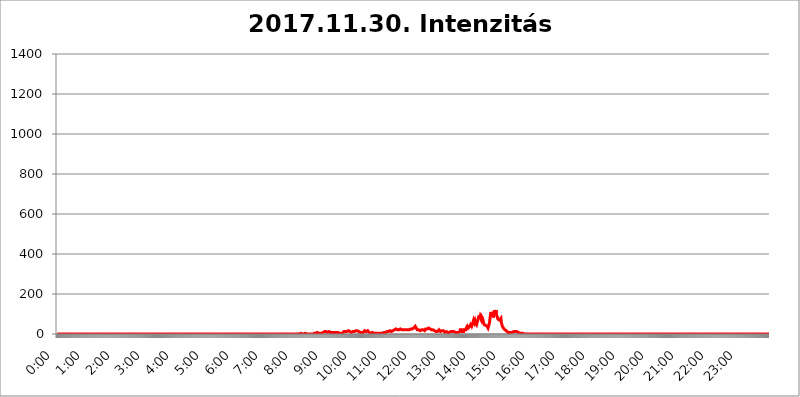
| Category | 2017.11.30. Intenzitás [W/m^2] |
|---|---|
| 0.0 | 0 |
| 0.0006944444444444445 | 0 |
| 0.001388888888888889 | 0 |
| 0.0020833333333333333 | 0 |
| 0.002777777777777778 | 0 |
| 0.003472222222222222 | 0 |
| 0.004166666666666667 | 0 |
| 0.004861111111111111 | 0 |
| 0.005555555555555556 | 0 |
| 0.0062499999999999995 | 0 |
| 0.006944444444444444 | 0 |
| 0.007638888888888889 | 0 |
| 0.008333333333333333 | 0 |
| 0.009027777777777779 | 0 |
| 0.009722222222222222 | 0 |
| 0.010416666666666666 | 0 |
| 0.011111111111111112 | 0 |
| 0.011805555555555555 | 0 |
| 0.012499999999999999 | 0 |
| 0.013194444444444444 | 0 |
| 0.013888888888888888 | 0 |
| 0.014583333333333332 | 0 |
| 0.015277777777777777 | 0 |
| 0.015972222222222224 | 0 |
| 0.016666666666666666 | 0 |
| 0.017361111111111112 | 0 |
| 0.018055555555555557 | 0 |
| 0.01875 | 0 |
| 0.019444444444444445 | 0 |
| 0.02013888888888889 | 0 |
| 0.020833333333333332 | 0 |
| 0.02152777777777778 | 0 |
| 0.022222222222222223 | 0 |
| 0.02291666666666667 | 0 |
| 0.02361111111111111 | 0 |
| 0.024305555555555556 | 0 |
| 0.024999999999999998 | 0 |
| 0.025694444444444447 | 0 |
| 0.02638888888888889 | 0 |
| 0.027083333333333334 | 0 |
| 0.027777777777777776 | 0 |
| 0.02847222222222222 | 0 |
| 0.029166666666666664 | 0 |
| 0.029861111111111113 | 0 |
| 0.030555555555555555 | 0 |
| 0.03125 | 0 |
| 0.03194444444444445 | 0 |
| 0.03263888888888889 | 0 |
| 0.03333333333333333 | 0 |
| 0.034027777777777775 | 0 |
| 0.034722222222222224 | 0 |
| 0.035416666666666666 | 0 |
| 0.036111111111111115 | 0 |
| 0.03680555555555556 | 0 |
| 0.0375 | 0 |
| 0.03819444444444444 | 0 |
| 0.03888888888888889 | 0 |
| 0.03958333333333333 | 0 |
| 0.04027777777777778 | 0 |
| 0.04097222222222222 | 0 |
| 0.041666666666666664 | 0 |
| 0.042361111111111106 | 0 |
| 0.04305555555555556 | 0 |
| 0.043750000000000004 | 0 |
| 0.044444444444444446 | 0 |
| 0.04513888888888889 | 0 |
| 0.04583333333333334 | 0 |
| 0.04652777777777778 | 0 |
| 0.04722222222222222 | 0 |
| 0.04791666666666666 | 0 |
| 0.04861111111111111 | 0 |
| 0.049305555555555554 | 0 |
| 0.049999999999999996 | 0 |
| 0.05069444444444445 | 0 |
| 0.051388888888888894 | 0 |
| 0.052083333333333336 | 0 |
| 0.05277777777777778 | 0 |
| 0.05347222222222222 | 0 |
| 0.05416666666666667 | 0 |
| 0.05486111111111111 | 0 |
| 0.05555555555555555 | 0 |
| 0.05625 | 0 |
| 0.05694444444444444 | 0 |
| 0.057638888888888885 | 0 |
| 0.05833333333333333 | 0 |
| 0.05902777777777778 | 0 |
| 0.059722222222222225 | 0 |
| 0.06041666666666667 | 0 |
| 0.061111111111111116 | 0 |
| 0.06180555555555556 | 0 |
| 0.0625 | 0 |
| 0.06319444444444444 | 0 |
| 0.06388888888888888 | 0 |
| 0.06458333333333334 | 0 |
| 0.06527777777777778 | 0 |
| 0.06597222222222222 | 0 |
| 0.06666666666666667 | 0 |
| 0.06736111111111111 | 0 |
| 0.06805555555555555 | 0 |
| 0.06874999999999999 | 0 |
| 0.06944444444444443 | 0 |
| 0.07013888888888889 | 0 |
| 0.07083333333333333 | 0 |
| 0.07152777777777779 | 0 |
| 0.07222222222222223 | 0 |
| 0.07291666666666667 | 0 |
| 0.07361111111111111 | 0 |
| 0.07430555555555556 | 0 |
| 0.075 | 0 |
| 0.07569444444444444 | 0 |
| 0.0763888888888889 | 0 |
| 0.07708333333333334 | 0 |
| 0.07777777777777778 | 0 |
| 0.07847222222222222 | 0 |
| 0.07916666666666666 | 0 |
| 0.0798611111111111 | 0 |
| 0.08055555555555556 | 0 |
| 0.08125 | 0 |
| 0.08194444444444444 | 0 |
| 0.08263888888888889 | 0 |
| 0.08333333333333333 | 0 |
| 0.08402777777777777 | 0 |
| 0.08472222222222221 | 0 |
| 0.08541666666666665 | 0 |
| 0.08611111111111112 | 0 |
| 0.08680555555555557 | 0 |
| 0.08750000000000001 | 0 |
| 0.08819444444444445 | 0 |
| 0.08888888888888889 | 0 |
| 0.08958333333333333 | 0 |
| 0.09027777777777778 | 0 |
| 0.09097222222222222 | 0 |
| 0.09166666666666667 | 0 |
| 0.09236111111111112 | 0 |
| 0.09305555555555556 | 0 |
| 0.09375 | 0 |
| 0.09444444444444444 | 0 |
| 0.09513888888888888 | 0 |
| 0.09583333333333333 | 0 |
| 0.09652777777777777 | 0 |
| 0.09722222222222222 | 0 |
| 0.09791666666666667 | 0 |
| 0.09861111111111111 | 0 |
| 0.09930555555555555 | 0 |
| 0.09999999999999999 | 0 |
| 0.10069444444444443 | 0 |
| 0.1013888888888889 | 0 |
| 0.10208333333333335 | 0 |
| 0.10277777777777779 | 0 |
| 0.10347222222222223 | 0 |
| 0.10416666666666667 | 0 |
| 0.10486111111111111 | 0 |
| 0.10555555555555556 | 0 |
| 0.10625 | 0 |
| 0.10694444444444444 | 0 |
| 0.1076388888888889 | 0 |
| 0.10833333333333334 | 0 |
| 0.10902777777777778 | 0 |
| 0.10972222222222222 | 0 |
| 0.1111111111111111 | 0 |
| 0.11180555555555556 | 0 |
| 0.11180555555555556 | 0 |
| 0.1125 | 0 |
| 0.11319444444444444 | 0 |
| 0.11388888888888889 | 0 |
| 0.11458333333333333 | 0 |
| 0.11527777777777777 | 0 |
| 0.11597222222222221 | 0 |
| 0.11666666666666665 | 0 |
| 0.1173611111111111 | 0 |
| 0.11805555555555557 | 0 |
| 0.11944444444444445 | 0 |
| 0.12013888888888889 | 0 |
| 0.12083333333333333 | 0 |
| 0.12152777777777778 | 0 |
| 0.12222222222222223 | 0 |
| 0.12291666666666667 | 0 |
| 0.12291666666666667 | 0 |
| 0.12361111111111112 | 0 |
| 0.12430555555555556 | 0 |
| 0.125 | 0 |
| 0.12569444444444444 | 0 |
| 0.12638888888888888 | 0 |
| 0.12708333333333333 | 0 |
| 0.16875 | 0 |
| 0.12847222222222224 | 0 |
| 0.12916666666666668 | 0 |
| 0.12986111111111112 | 0 |
| 0.13055555555555556 | 0 |
| 0.13125 | 0 |
| 0.13194444444444445 | 0 |
| 0.1326388888888889 | 0 |
| 0.13333333333333333 | 0 |
| 0.13402777777777777 | 0 |
| 0.13402777777777777 | 0 |
| 0.13472222222222222 | 0 |
| 0.13541666666666666 | 0 |
| 0.1361111111111111 | 0 |
| 0.13749999999999998 | 0 |
| 0.13819444444444443 | 0 |
| 0.1388888888888889 | 0 |
| 0.13958333333333334 | 0 |
| 0.14027777777777778 | 0 |
| 0.14097222222222222 | 0 |
| 0.14166666666666666 | 0 |
| 0.1423611111111111 | 0 |
| 0.14305555555555557 | 0 |
| 0.14375000000000002 | 0 |
| 0.14444444444444446 | 0 |
| 0.1451388888888889 | 0 |
| 0.1451388888888889 | 0 |
| 0.14652777777777778 | 0 |
| 0.14722222222222223 | 0 |
| 0.14791666666666667 | 0 |
| 0.1486111111111111 | 0 |
| 0.14930555555555555 | 0 |
| 0.15 | 0 |
| 0.15069444444444444 | 0 |
| 0.15138888888888888 | 0 |
| 0.15208333333333332 | 0 |
| 0.15277777777777776 | 0 |
| 0.15347222222222223 | 0 |
| 0.15416666666666667 | 0 |
| 0.15486111111111112 | 0 |
| 0.15555555555555556 | 0 |
| 0.15625 | 0 |
| 0.15694444444444444 | 0 |
| 0.15763888888888888 | 0 |
| 0.15833333333333333 | 0 |
| 0.15902777777777777 | 0 |
| 0.15972222222222224 | 0 |
| 0.16041666666666668 | 0 |
| 0.16111111111111112 | 0 |
| 0.16180555555555556 | 0 |
| 0.1625 | 0 |
| 0.16319444444444445 | 0 |
| 0.1638888888888889 | 0 |
| 0.16458333333333333 | 0 |
| 0.16527777777777777 | 0 |
| 0.16597222222222222 | 0 |
| 0.16666666666666666 | 0 |
| 0.1673611111111111 | 0 |
| 0.16805555555555554 | 0 |
| 0.16874999999999998 | 0 |
| 0.16944444444444443 | 0 |
| 0.17013888888888887 | 0 |
| 0.1708333333333333 | 0 |
| 0.17152777777777775 | 0 |
| 0.17222222222222225 | 0 |
| 0.1729166666666667 | 0 |
| 0.17361111111111113 | 0 |
| 0.17430555555555557 | 0 |
| 0.17500000000000002 | 0 |
| 0.17569444444444446 | 0 |
| 0.1763888888888889 | 0 |
| 0.17708333333333334 | 0 |
| 0.17777777777777778 | 0 |
| 0.17847222222222223 | 0 |
| 0.17916666666666667 | 0 |
| 0.1798611111111111 | 0 |
| 0.18055555555555555 | 0 |
| 0.18125 | 0 |
| 0.18194444444444444 | 0 |
| 0.1826388888888889 | 0 |
| 0.18333333333333335 | 0 |
| 0.1840277777777778 | 0 |
| 0.18472222222222223 | 0 |
| 0.18541666666666667 | 0 |
| 0.18611111111111112 | 0 |
| 0.18680555555555556 | 0 |
| 0.1875 | 0 |
| 0.18819444444444444 | 0 |
| 0.18888888888888888 | 0 |
| 0.18958333333333333 | 0 |
| 0.19027777777777777 | 0 |
| 0.1909722222222222 | 0 |
| 0.19166666666666665 | 0 |
| 0.19236111111111112 | 0 |
| 0.19305555555555554 | 0 |
| 0.19375 | 0 |
| 0.19444444444444445 | 0 |
| 0.1951388888888889 | 0 |
| 0.19583333333333333 | 0 |
| 0.19652777777777777 | 0 |
| 0.19722222222222222 | 0 |
| 0.19791666666666666 | 0 |
| 0.1986111111111111 | 0 |
| 0.19930555555555554 | 0 |
| 0.19999999999999998 | 0 |
| 0.20069444444444443 | 0 |
| 0.20138888888888887 | 0 |
| 0.2020833333333333 | 0 |
| 0.2027777777777778 | 0 |
| 0.2034722222222222 | 0 |
| 0.2041666666666667 | 0 |
| 0.20486111111111113 | 0 |
| 0.20555555555555557 | 0 |
| 0.20625000000000002 | 0 |
| 0.20694444444444446 | 0 |
| 0.2076388888888889 | 0 |
| 0.20833333333333334 | 0 |
| 0.20902777777777778 | 0 |
| 0.20972222222222223 | 0 |
| 0.21041666666666667 | 0 |
| 0.2111111111111111 | 0 |
| 0.21180555555555555 | 0 |
| 0.2125 | 0 |
| 0.21319444444444444 | 0 |
| 0.2138888888888889 | 0 |
| 0.21458333333333335 | 0 |
| 0.2152777777777778 | 0 |
| 0.21597222222222223 | 0 |
| 0.21666666666666667 | 0 |
| 0.21736111111111112 | 0 |
| 0.21805555555555556 | 0 |
| 0.21875 | 0 |
| 0.21944444444444444 | 0 |
| 0.22013888888888888 | 0 |
| 0.22083333333333333 | 0 |
| 0.22152777777777777 | 0 |
| 0.2222222222222222 | 0 |
| 0.22291666666666665 | 0 |
| 0.2236111111111111 | 0 |
| 0.22430555555555556 | 0 |
| 0.225 | 0 |
| 0.22569444444444445 | 0 |
| 0.2263888888888889 | 0 |
| 0.22708333333333333 | 0 |
| 0.22777777777777777 | 0 |
| 0.22847222222222222 | 0 |
| 0.22916666666666666 | 0 |
| 0.2298611111111111 | 0 |
| 0.23055555555555554 | 0 |
| 0.23124999999999998 | 0 |
| 0.23194444444444443 | 0 |
| 0.23263888888888887 | 0 |
| 0.2333333333333333 | 0 |
| 0.2340277777777778 | 0 |
| 0.2347222222222222 | 0 |
| 0.2354166666666667 | 0 |
| 0.23611111111111113 | 0 |
| 0.23680555555555557 | 0 |
| 0.23750000000000002 | 0 |
| 0.23819444444444446 | 0 |
| 0.2388888888888889 | 0 |
| 0.23958333333333334 | 0 |
| 0.24027777777777778 | 0 |
| 0.24097222222222223 | 0 |
| 0.24166666666666667 | 0 |
| 0.2423611111111111 | 0 |
| 0.24305555555555555 | 0 |
| 0.24375 | 0 |
| 0.24444444444444446 | 0 |
| 0.24513888888888888 | 0 |
| 0.24583333333333335 | 0 |
| 0.2465277777777778 | 0 |
| 0.24722222222222223 | 0 |
| 0.24791666666666667 | 0 |
| 0.24861111111111112 | 0 |
| 0.24930555555555556 | 0 |
| 0.25 | 0 |
| 0.25069444444444444 | 0 |
| 0.2513888888888889 | 0 |
| 0.2520833333333333 | 0 |
| 0.25277777777777777 | 0 |
| 0.2534722222222222 | 0 |
| 0.25416666666666665 | 0 |
| 0.2548611111111111 | 0 |
| 0.2555555555555556 | 0 |
| 0.25625000000000003 | 0 |
| 0.2569444444444445 | 0 |
| 0.2576388888888889 | 0 |
| 0.25833333333333336 | 0 |
| 0.2590277777777778 | 0 |
| 0.25972222222222224 | 0 |
| 0.2604166666666667 | 0 |
| 0.2611111111111111 | 0 |
| 0.26180555555555557 | 0 |
| 0.2625 | 0 |
| 0.26319444444444445 | 0 |
| 0.2638888888888889 | 0 |
| 0.26458333333333334 | 0 |
| 0.2652777777777778 | 0 |
| 0.2659722222222222 | 0 |
| 0.26666666666666666 | 0 |
| 0.2673611111111111 | 0 |
| 0.26805555555555555 | 0 |
| 0.26875 | 0 |
| 0.26944444444444443 | 0 |
| 0.2701388888888889 | 0 |
| 0.2708333333333333 | 0 |
| 0.27152777777777776 | 0 |
| 0.2722222222222222 | 0 |
| 0.27291666666666664 | 0 |
| 0.2736111111111111 | 0 |
| 0.2743055555555555 | 0 |
| 0.27499999999999997 | 0 |
| 0.27569444444444446 | 0 |
| 0.27638888888888885 | 0 |
| 0.27708333333333335 | 0 |
| 0.2777777777777778 | 0 |
| 0.27847222222222223 | 0 |
| 0.2791666666666667 | 0 |
| 0.2798611111111111 | 0 |
| 0.28055555555555556 | 0 |
| 0.28125 | 0 |
| 0.28194444444444444 | 0 |
| 0.2826388888888889 | 0 |
| 0.2833333333333333 | 0 |
| 0.28402777777777777 | 0 |
| 0.2847222222222222 | 0 |
| 0.28541666666666665 | 0 |
| 0.28611111111111115 | 0 |
| 0.28680555555555554 | 0 |
| 0.28750000000000003 | 0 |
| 0.2881944444444445 | 0 |
| 0.2888888888888889 | 0 |
| 0.28958333333333336 | 0 |
| 0.2902777777777778 | 0 |
| 0.29097222222222224 | 0 |
| 0.2916666666666667 | 0 |
| 0.2923611111111111 | 0 |
| 0.29305555555555557 | 0 |
| 0.29375 | 0 |
| 0.29444444444444445 | 0 |
| 0.2951388888888889 | 0 |
| 0.29583333333333334 | 0 |
| 0.2965277777777778 | 0 |
| 0.2972222222222222 | 0 |
| 0.29791666666666666 | 0 |
| 0.2986111111111111 | 0 |
| 0.29930555555555555 | 0 |
| 0.3 | 0 |
| 0.30069444444444443 | 0 |
| 0.3013888888888889 | 0 |
| 0.3020833333333333 | 0 |
| 0.30277777777777776 | 0 |
| 0.3034722222222222 | 0 |
| 0.30416666666666664 | 0 |
| 0.3048611111111111 | 0 |
| 0.3055555555555555 | 0 |
| 0.30624999999999997 | 0 |
| 0.3069444444444444 | 0 |
| 0.3076388888888889 | 0 |
| 0.30833333333333335 | 0 |
| 0.3090277777777778 | 0 |
| 0.30972222222222223 | 0 |
| 0.3104166666666667 | 0 |
| 0.3111111111111111 | 0 |
| 0.31180555555555556 | 0 |
| 0.3125 | 0 |
| 0.31319444444444444 | 0 |
| 0.3138888888888889 | 0 |
| 0.3145833333333333 | 0 |
| 0.31527777777777777 | 0 |
| 0.3159722222222222 | 0 |
| 0.31666666666666665 | 0 |
| 0.31736111111111115 | 0 |
| 0.31805555555555554 | 0 |
| 0.31875000000000003 | 0 |
| 0.3194444444444445 | 0 |
| 0.3201388888888889 | 0 |
| 0.32083333333333336 | 0 |
| 0.3215277777777778 | 0 |
| 0.32222222222222224 | 0 |
| 0.3229166666666667 | 0 |
| 0.3236111111111111 | 0 |
| 0.32430555555555557 | 0 |
| 0.325 | 0 |
| 0.32569444444444445 | 0 |
| 0.3263888888888889 | 0 |
| 0.32708333333333334 | 0 |
| 0.3277777777777778 | 0 |
| 0.3284722222222222 | 0 |
| 0.32916666666666666 | 0 |
| 0.3298611111111111 | 0 |
| 0.33055555555555555 | 0 |
| 0.33125 | 0 |
| 0.33194444444444443 | 0 |
| 0.3326388888888889 | 0 |
| 0.3333333333333333 | 0 |
| 0.3340277777777778 | 0 |
| 0.3347222222222222 | 0 |
| 0.3354166666666667 | 0 |
| 0.3361111111111111 | 0 |
| 0.3368055555555556 | 0 |
| 0.33749999999999997 | 0 |
| 0.33819444444444446 | 0 |
| 0.33888888888888885 | 0 |
| 0.33958333333333335 | 0 |
| 0.34027777777777773 | 0 |
| 0.34097222222222223 | 3.525 |
| 0.3416666666666666 | 3.525 |
| 0.3423611111111111 | 3.525 |
| 0.3430555555555555 | 0 |
| 0.34375 | 0 |
| 0.3444444444444445 | 0 |
| 0.3451388888888889 | 0 |
| 0.3458333333333334 | 0 |
| 0.34652777777777777 | 3.525 |
| 0.34722222222222227 | 3.525 |
| 0.34791666666666665 | 3.525 |
| 0.34861111111111115 | 0 |
| 0.34930555555555554 | 0 |
| 0.35000000000000003 | 0 |
| 0.3506944444444444 | 0 |
| 0.3513888888888889 | 0 |
| 0.3520833333333333 | 0 |
| 0.3527777777777778 | 0 |
| 0.3534722222222222 | 0 |
| 0.3541666666666667 | 0 |
| 0.3548611111111111 | 0 |
| 0.35555555555555557 | 0 |
| 0.35625 | 0 |
| 0.35694444444444445 | 0 |
| 0.3576388888888889 | 0 |
| 0.35833333333333334 | 0 |
| 0.3590277777777778 | 0 |
| 0.3597222222222222 | 3.525 |
| 0.36041666666666666 | 3.525 |
| 0.3611111111111111 | 3.525 |
| 0.36180555555555555 | 3.525 |
| 0.3625 | 3.525 |
| 0.36319444444444443 | 3.525 |
| 0.3638888888888889 | 3.525 |
| 0.3645833333333333 | 7.887 |
| 0.3652777777777778 | 7.887 |
| 0.3659722222222222 | 3.525 |
| 0.3666666666666667 | 3.525 |
| 0.3673611111111111 | 3.525 |
| 0.3680555555555556 | 3.525 |
| 0.36874999999999997 | 3.525 |
| 0.36944444444444446 | 3.525 |
| 0.37013888888888885 | 3.525 |
| 0.37083333333333335 | 3.525 |
| 0.37152777777777773 | 3.525 |
| 0.37222222222222223 | 7.887 |
| 0.3729166666666666 | 7.887 |
| 0.3736111111111111 | 12.257 |
| 0.3743055555555555 | 12.257 |
| 0.375 | 12.257 |
| 0.3756944444444445 | 12.257 |
| 0.3763888888888889 | 12.257 |
| 0.3770833333333334 | 12.257 |
| 0.37777777777777777 | 12.257 |
| 0.37847222222222227 | 7.887 |
| 0.37916666666666665 | 7.887 |
| 0.37986111111111115 | 12.257 |
| 0.38055555555555554 | 12.257 |
| 0.38125000000000003 | 12.257 |
| 0.3819444444444444 | 7.887 |
| 0.3826388888888889 | 7.887 |
| 0.3833333333333333 | 7.887 |
| 0.3840277777777778 | 7.887 |
| 0.3847222222222222 | 7.887 |
| 0.3854166666666667 | 7.887 |
| 0.3861111111111111 | 7.887 |
| 0.38680555555555557 | 7.887 |
| 0.3875 | 7.887 |
| 0.38819444444444445 | 7.887 |
| 0.3888888888888889 | 12.257 |
| 0.38958333333333334 | 7.887 |
| 0.3902777777777778 | 7.887 |
| 0.3909722222222222 | 7.887 |
| 0.39166666666666666 | 7.887 |
| 0.3923611111111111 | 7.887 |
| 0.39305555555555555 | 7.887 |
| 0.39375 | 7.887 |
| 0.39444444444444443 | 3.525 |
| 0.3951388888888889 | 3.525 |
| 0.3958333333333333 | 3.525 |
| 0.3965277777777778 | 3.525 |
| 0.3972222222222222 | 3.525 |
| 0.3979166666666667 | 3.525 |
| 0.3986111111111111 | 3.525 |
| 0.3993055555555556 | 3.525 |
| 0.39999999999999997 | 3.525 |
| 0.40069444444444446 | 7.887 |
| 0.40138888888888885 | 7.887 |
| 0.40208333333333335 | 12.257 |
| 0.40277777777777773 | 12.257 |
| 0.40347222222222223 | 12.257 |
| 0.4041666666666666 | 12.257 |
| 0.4048611111111111 | 12.257 |
| 0.4055555555555555 | 12.257 |
| 0.40625 | 12.257 |
| 0.4069444444444445 | 12.257 |
| 0.4076388888888889 | 16.636 |
| 0.4083333333333334 | 16.636 |
| 0.40902777777777777 | 12.257 |
| 0.40972222222222227 | 12.257 |
| 0.41041666666666665 | 12.257 |
| 0.41111111111111115 | 12.257 |
| 0.41180555555555554 | 7.887 |
| 0.41250000000000003 | 7.887 |
| 0.4131944444444444 | 7.887 |
| 0.4138888888888889 | 12.257 |
| 0.4145833333333333 | 12.257 |
| 0.4152777777777778 | 12.257 |
| 0.4159722222222222 | 12.257 |
| 0.4166666666666667 | 12.257 |
| 0.4173611111111111 | 12.257 |
| 0.41805555555555557 | 16.636 |
| 0.41875 | 16.636 |
| 0.41944444444444445 | 16.636 |
| 0.4201388888888889 | 16.636 |
| 0.42083333333333334 | 16.636 |
| 0.4215277777777778 | 16.636 |
| 0.4222222222222222 | 16.636 |
| 0.42291666666666666 | 12.257 |
| 0.4236111111111111 | 12.257 |
| 0.42430555555555555 | 12.257 |
| 0.425 | 7.887 |
| 0.42569444444444443 | 7.887 |
| 0.4263888888888889 | 7.887 |
| 0.4270833333333333 | 7.887 |
| 0.4277777777777778 | 7.887 |
| 0.4284722222222222 | 7.887 |
| 0.4291666666666667 | 7.887 |
| 0.4298611111111111 | 7.887 |
| 0.4305555555555556 | 12.257 |
| 0.43124999999999997 | 16.636 |
| 0.43194444444444446 | 16.636 |
| 0.43263888888888885 | 16.636 |
| 0.43333333333333335 | 12.257 |
| 0.43402777777777773 | 12.257 |
| 0.43472222222222223 | 16.636 |
| 0.4354166666666666 | 16.636 |
| 0.4361111111111111 | 16.636 |
| 0.4368055555555555 | 12.257 |
| 0.4375 | 7.887 |
| 0.4381944444444445 | 7.887 |
| 0.4388888888888889 | 7.887 |
| 0.4395833333333334 | 3.525 |
| 0.44027777777777777 | 3.525 |
| 0.44097222222222227 | 7.887 |
| 0.44166666666666665 | 7.887 |
| 0.44236111111111115 | 7.887 |
| 0.44305555555555554 | 3.525 |
| 0.44375000000000003 | 3.525 |
| 0.4444444444444444 | 3.525 |
| 0.4451388888888889 | 3.525 |
| 0.4458333333333333 | 3.525 |
| 0.4465277777777778 | 3.525 |
| 0.4472222222222222 | 3.525 |
| 0.4479166666666667 | 3.525 |
| 0.4486111111111111 | 3.525 |
| 0.44930555555555557 | 3.525 |
| 0.45 | 3.525 |
| 0.45069444444444445 | 3.525 |
| 0.4513888888888889 | 3.525 |
| 0.45208333333333334 | 3.525 |
| 0.4527777777777778 | 3.525 |
| 0.4534722222222222 | 3.525 |
| 0.45416666666666666 | 3.525 |
| 0.4548611111111111 | 3.525 |
| 0.45555555555555555 | 3.525 |
| 0.45625 | 3.525 |
| 0.45694444444444443 | 7.887 |
| 0.4576388888888889 | 7.887 |
| 0.4583333333333333 | 7.887 |
| 0.4590277777777778 | 7.887 |
| 0.4597222222222222 | 7.887 |
| 0.4604166666666667 | 7.887 |
| 0.4611111111111111 | 7.887 |
| 0.4618055555555556 | 7.887 |
| 0.46249999999999997 | 12.257 |
| 0.46319444444444446 | 12.257 |
| 0.46388888888888885 | 12.257 |
| 0.46458333333333335 | 12.257 |
| 0.46527777777777773 | 16.636 |
| 0.46597222222222223 | 16.636 |
| 0.4666666666666666 | 16.636 |
| 0.4673611111111111 | 16.636 |
| 0.4680555555555555 | 16.636 |
| 0.46875 | 12.257 |
| 0.4694444444444445 | 12.257 |
| 0.4701388888888889 | 12.257 |
| 0.4708333333333334 | 16.636 |
| 0.47152777777777777 | 16.636 |
| 0.47222222222222227 | 16.636 |
| 0.47291666666666665 | 21.024 |
| 0.47361111111111115 | 25.419 |
| 0.47430555555555554 | 25.419 |
| 0.47500000000000003 | 25.419 |
| 0.4756944444444444 | 25.419 |
| 0.4763888888888889 | 25.419 |
| 0.4770833333333333 | 21.024 |
| 0.4777777777777778 | 21.024 |
| 0.4784722222222222 | 21.024 |
| 0.4791666666666667 | 21.024 |
| 0.4798611111111111 | 21.024 |
| 0.48055555555555557 | 21.024 |
| 0.48125 | 25.419 |
| 0.48194444444444445 | 25.419 |
| 0.4826388888888889 | 25.419 |
| 0.48333333333333334 | 21.024 |
| 0.4840277777777778 | 21.024 |
| 0.4847222222222222 | 21.024 |
| 0.48541666666666666 | 21.024 |
| 0.4861111111111111 | 21.024 |
| 0.48680555555555555 | 21.024 |
| 0.4875 | 21.024 |
| 0.48819444444444443 | 21.024 |
| 0.4888888888888889 | 21.024 |
| 0.4895833333333333 | 21.024 |
| 0.4902777777777778 | 21.024 |
| 0.4909722222222222 | 21.024 |
| 0.4916666666666667 | 21.024 |
| 0.4923611111111111 | 21.024 |
| 0.4930555555555556 | 21.024 |
| 0.49374999999999997 | 21.024 |
| 0.49444444444444446 | 21.024 |
| 0.49513888888888885 | 21.024 |
| 0.49583333333333335 | 25.419 |
| 0.49652777777777773 | 25.419 |
| 0.49722222222222223 | 25.419 |
| 0.4979166666666666 | 25.419 |
| 0.4986111111111111 | 29.823 |
| 0.4993055555555555 | 29.823 |
| 0.5 | 29.823 |
| 0.5006944444444444 | 29.823 |
| 0.5013888888888889 | 34.234 |
| 0.5020833333333333 | 38.653 |
| 0.5027777777777778 | 34.234 |
| 0.5034722222222222 | 29.823 |
| 0.5041666666666667 | 25.419 |
| 0.5048611111111111 | 21.024 |
| 0.5055555555555555 | 21.024 |
| 0.50625 | 21.024 |
| 0.5069444444444444 | 21.024 |
| 0.5076388888888889 | 21.024 |
| 0.5083333333333333 | 21.024 |
| 0.5090277777777777 | 16.636 |
| 0.5097222222222222 | 16.636 |
| 0.5104166666666666 | 21.024 |
| 0.5111111111111112 | 21.024 |
| 0.5118055555555555 | 21.024 |
| 0.5125000000000001 | 21.024 |
| 0.5131944444444444 | 21.024 |
| 0.513888888888889 | 21.024 |
| 0.5145833333333333 | 21.024 |
| 0.5152777777777778 | 16.636 |
| 0.5159722222222222 | 21.024 |
| 0.5166666666666667 | 25.419 |
| 0.517361111111111 | 25.419 |
| 0.5180555555555556 | 25.419 |
| 0.5187499999999999 | 25.419 |
| 0.5194444444444445 | 25.419 |
| 0.5201388888888888 | 29.823 |
| 0.5208333333333334 | 29.823 |
| 0.5215277777777778 | 29.823 |
| 0.5222222222222223 | 25.419 |
| 0.5229166666666667 | 25.419 |
| 0.5236111111111111 | 21.024 |
| 0.5243055555555556 | 21.024 |
| 0.525 | 21.024 |
| 0.5256944444444445 | 21.024 |
| 0.5263888888888889 | 21.024 |
| 0.5270833333333333 | 21.024 |
| 0.5277777777777778 | 16.636 |
| 0.5284722222222222 | 16.636 |
| 0.5291666666666667 | 16.636 |
| 0.5298611111111111 | 16.636 |
| 0.5305555555555556 | 16.636 |
| 0.53125 | 12.257 |
| 0.5319444444444444 | 12.257 |
| 0.5326388888888889 | 12.257 |
| 0.5333333333333333 | 12.257 |
| 0.5340277777777778 | 16.636 |
| 0.5347222222222222 | 16.636 |
| 0.5354166666666667 | 21.024 |
| 0.5361111111111111 | 21.024 |
| 0.5368055555555555 | 16.636 |
| 0.5375 | 12.257 |
| 0.5381944444444444 | 16.636 |
| 0.5388888888888889 | 16.636 |
| 0.5395833333333333 | 16.636 |
| 0.5402777777777777 | 16.636 |
| 0.5409722222222222 | 16.636 |
| 0.5416666666666666 | 16.636 |
| 0.5423611111111112 | 12.257 |
| 0.5430555555555555 | 12.257 |
| 0.5437500000000001 | 7.887 |
| 0.5444444444444444 | 7.887 |
| 0.545138888888889 | 7.887 |
| 0.5458333333333333 | 12.257 |
| 0.5465277777777778 | 12.257 |
| 0.5472222222222222 | 7.887 |
| 0.5479166666666667 | 7.887 |
| 0.548611111111111 | 7.887 |
| 0.5493055555555556 | 12.257 |
| 0.5499999999999999 | 7.887 |
| 0.5506944444444445 | 7.887 |
| 0.5513888888888888 | 12.257 |
| 0.5520833333333334 | 12.257 |
| 0.5527777777777778 | 12.257 |
| 0.5534722222222223 | 7.887 |
| 0.5541666666666667 | 12.257 |
| 0.5548611111111111 | 12.257 |
| 0.5555555555555556 | 12.257 |
| 0.55625 | 12.257 |
| 0.5569444444444445 | 7.887 |
| 0.5576388888888889 | 7.887 |
| 0.5583333333333333 | 7.887 |
| 0.5590277777777778 | 7.887 |
| 0.5597222222222222 | 3.525 |
| 0.5604166666666667 | 7.887 |
| 0.5611111111111111 | 7.887 |
| 0.5618055555555556 | 7.887 |
| 0.5625 | 7.887 |
| 0.5631944444444444 | 7.887 |
| 0.5638888888888889 | 12.257 |
| 0.5645833333333333 | 12.257 |
| 0.5652777777777778 | 21.024 |
| 0.5659722222222222 | 25.419 |
| 0.5666666666666667 | 25.419 |
| 0.5673611111111111 | 21.024 |
| 0.5680555555555555 | 12.257 |
| 0.56875 | 12.257 |
| 0.5694444444444444 | 12.257 |
| 0.5701388888888889 | 12.257 |
| 0.5708333333333333 | 21.024 |
| 0.5715277777777777 | 25.419 |
| 0.5722222222222222 | 21.024 |
| 0.5729166666666666 | 21.024 |
| 0.5736111111111112 | 29.823 |
| 0.5743055555555555 | 34.234 |
| 0.5750000000000001 | 38.653 |
| 0.5756944444444444 | 34.234 |
| 0.576388888888889 | 29.823 |
| 0.5770833333333333 | 29.823 |
| 0.5777777777777778 | 29.823 |
| 0.5784722222222222 | 38.653 |
| 0.5791666666666667 | 43.079 |
| 0.579861111111111 | 47.511 |
| 0.5805555555555556 | 47.511 |
| 0.5812499999999999 | 38.653 |
| 0.5819444444444445 | 43.079 |
| 0.5826388888888888 | 51.951 |
| 0.5833333333333334 | 60.85 |
| 0.5840277777777778 | 69.775 |
| 0.5847222222222223 | 74.246 |
| 0.5854166666666667 | 56.398 |
| 0.5861111111111111 | 65.31 |
| 0.5868055555555556 | 56.398 |
| 0.5875 | 51.951 |
| 0.5881944444444445 | 47.511 |
| 0.5888888888888889 | 56.398 |
| 0.5895833333333333 | 65.31 |
| 0.5902777777777778 | 74.246 |
| 0.5909722222222222 | 74.246 |
| 0.5916666666666667 | 92.184 |
| 0.5923611111111111 | 78.722 |
| 0.5930555555555556 | 87.692 |
| 0.59375 | 83.205 |
| 0.5944444444444444 | 74.246 |
| 0.5951388888888889 | 87.692 |
| 0.5958333333333333 | 87.692 |
| 0.5965277777777778 | 78.722 |
| 0.5972222222222222 | 74.246 |
| 0.5979166666666667 | 56.398 |
| 0.5986111111111111 | 47.511 |
| 0.5993055555555555 | 51.951 |
| 0.6 | 43.079 |
| 0.6006944444444444 | 43.079 |
| 0.6013888888888889 | 38.653 |
| 0.6020833333333333 | 38.653 |
| 0.6027777777777777 | 38.653 |
| 0.6034722222222222 | 34.234 |
| 0.6041666666666666 | 29.823 |
| 0.6048611111111112 | 38.653 |
| 0.6055555555555555 | 38.653 |
| 0.6062500000000001 | 56.398 |
| 0.6069444444444444 | 78.722 |
| 0.607638888888889 | 96.682 |
| 0.6083333333333333 | 110.201 |
| 0.6090277777777778 | 110.201 |
| 0.6097222222222222 | 105.69 |
| 0.6104166666666667 | 87.692 |
| 0.611111111111111 | 101.184 |
| 0.6118055555555556 | 83.205 |
| 0.6124999999999999 | 101.184 |
| 0.6131944444444445 | 119.235 |
| 0.6138888888888888 | 119.235 |
| 0.6145833333333334 | 101.184 |
| 0.6152777777777778 | 119.235 |
| 0.6159722222222223 | 96.682 |
| 0.6166666666666667 | 101.184 |
| 0.6173611111111111 | 83.205 |
| 0.6180555555555556 | 74.246 |
| 0.61875 | 74.246 |
| 0.6194444444444445 | 74.246 |
| 0.6201388888888889 | 69.775 |
| 0.6208333333333333 | 74.246 |
| 0.6215277777777778 | 74.246 |
| 0.6222222222222222 | 78.722 |
| 0.6229166666666667 | 56.398 |
| 0.6236111111111111 | 47.511 |
| 0.6243055555555556 | 38.653 |
| 0.625 | 34.234 |
| 0.6256944444444444 | 29.823 |
| 0.6263888888888889 | 29.823 |
| 0.6270833333333333 | 25.419 |
| 0.6277777777777778 | 21.024 |
| 0.6284722222222222 | 21.024 |
| 0.6291666666666667 | 16.636 |
| 0.6298611111111111 | 16.636 |
| 0.6305555555555555 | 16.636 |
| 0.63125 | 12.257 |
| 0.6319444444444444 | 7.887 |
| 0.6326388888888889 | 7.887 |
| 0.6333333333333333 | 12.257 |
| 0.6340277777777777 | 7.887 |
| 0.6347222222222222 | 7.887 |
| 0.6354166666666666 | 7.887 |
| 0.6361111111111112 | 7.887 |
| 0.6368055555555555 | 7.887 |
| 0.6375000000000001 | 7.887 |
| 0.6381944444444444 | 7.887 |
| 0.638888888888889 | 12.257 |
| 0.6395833333333333 | 12.257 |
| 0.6402777777777778 | 12.257 |
| 0.6409722222222222 | 12.257 |
| 0.6416666666666667 | 12.257 |
| 0.642361111111111 | 12.257 |
| 0.6430555555555556 | 12.257 |
| 0.6437499999999999 | 12.257 |
| 0.6444444444444445 | 12.257 |
| 0.6451388888888888 | 12.257 |
| 0.6458333333333334 | 7.887 |
| 0.6465277777777778 | 7.887 |
| 0.6472222222222223 | 3.525 |
| 0.6479166666666667 | 3.525 |
| 0.6486111111111111 | 3.525 |
| 0.6493055555555556 | 3.525 |
| 0.65 | 3.525 |
| 0.6506944444444445 | 3.525 |
| 0.6513888888888889 | 0 |
| 0.6520833333333333 | 0 |
| 0.6527777777777778 | 3.525 |
| 0.6534722222222222 | 0 |
| 0.6541666666666667 | 0 |
| 0.6548611111111111 | 0 |
| 0.6555555555555556 | 0 |
| 0.65625 | 0 |
| 0.6569444444444444 | 0 |
| 0.6576388888888889 | 0 |
| 0.6583333333333333 | 0 |
| 0.6590277777777778 | 0 |
| 0.6597222222222222 | 0 |
| 0.6604166666666667 | 0 |
| 0.6611111111111111 | 0 |
| 0.6618055555555555 | 0 |
| 0.6625 | 0 |
| 0.6631944444444444 | 0 |
| 0.6638888888888889 | 0 |
| 0.6645833333333333 | 0 |
| 0.6652777777777777 | 0 |
| 0.6659722222222222 | 0 |
| 0.6666666666666666 | 0 |
| 0.6673611111111111 | 0 |
| 0.6680555555555556 | 0 |
| 0.6687500000000001 | 0 |
| 0.6694444444444444 | 0 |
| 0.6701388888888888 | 0 |
| 0.6708333333333334 | 0 |
| 0.6715277777777778 | 0 |
| 0.6722222222222222 | 0 |
| 0.6729166666666666 | 0 |
| 0.6736111111111112 | 0 |
| 0.6743055555555556 | 0 |
| 0.6749999999999999 | 0 |
| 0.6756944444444444 | 0 |
| 0.6763888888888889 | 0 |
| 0.6770833333333334 | 0 |
| 0.6777777777777777 | 0 |
| 0.6784722222222223 | 0 |
| 0.6791666666666667 | 0 |
| 0.6798611111111111 | 0 |
| 0.6805555555555555 | 0 |
| 0.68125 | 0 |
| 0.6819444444444445 | 0 |
| 0.6826388888888889 | 0 |
| 0.6833333333333332 | 0 |
| 0.6840277777777778 | 0 |
| 0.6847222222222222 | 0 |
| 0.6854166666666667 | 0 |
| 0.686111111111111 | 0 |
| 0.6868055555555556 | 0 |
| 0.6875 | 0 |
| 0.6881944444444444 | 0 |
| 0.688888888888889 | 0 |
| 0.6895833333333333 | 0 |
| 0.6902777777777778 | 0 |
| 0.6909722222222222 | 0 |
| 0.6916666666666668 | 0 |
| 0.6923611111111111 | 0 |
| 0.6930555555555555 | 0 |
| 0.69375 | 0 |
| 0.6944444444444445 | 0 |
| 0.6951388888888889 | 0 |
| 0.6958333333333333 | 0 |
| 0.6965277777777777 | 0 |
| 0.6972222222222223 | 0 |
| 0.6979166666666666 | 0 |
| 0.6986111111111111 | 0 |
| 0.6993055555555556 | 0 |
| 0.7000000000000001 | 0 |
| 0.7006944444444444 | 0 |
| 0.7013888888888888 | 0 |
| 0.7020833333333334 | 0 |
| 0.7027777777777778 | 0 |
| 0.7034722222222222 | 0 |
| 0.7041666666666666 | 0 |
| 0.7048611111111112 | 0 |
| 0.7055555555555556 | 0 |
| 0.7062499999999999 | 0 |
| 0.7069444444444444 | 0 |
| 0.7076388888888889 | 0 |
| 0.7083333333333334 | 0 |
| 0.7090277777777777 | 0 |
| 0.7097222222222223 | 0 |
| 0.7104166666666667 | 0 |
| 0.7111111111111111 | 0 |
| 0.7118055555555555 | 0 |
| 0.7125 | 0 |
| 0.7131944444444445 | 0 |
| 0.7138888888888889 | 0 |
| 0.7145833333333332 | 0 |
| 0.7152777777777778 | 0 |
| 0.7159722222222222 | 0 |
| 0.7166666666666667 | 0 |
| 0.717361111111111 | 0 |
| 0.7180555555555556 | 0 |
| 0.71875 | 0 |
| 0.7194444444444444 | 0 |
| 0.720138888888889 | 0 |
| 0.7208333333333333 | 0 |
| 0.7215277777777778 | 0 |
| 0.7222222222222222 | 0 |
| 0.7229166666666668 | 0 |
| 0.7236111111111111 | 0 |
| 0.7243055555555555 | 0 |
| 0.725 | 0 |
| 0.7256944444444445 | 0 |
| 0.7263888888888889 | 0 |
| 0.7270833333333333 | 0 |
| 0.7277777777777777 | 0 |
| 0.7284722222222223 | 0 |
| 0.7291666666666666 | 0 |
| 0.7298611111111111 | 0 |
| 0.7305555555555556 | 0 |
| 0.7312500000000001 | 0 |
| 0.7319444444444444 | 0 |
| 0.7326388888888888 | 0 |
| 0.7333333333333334 | 0 |
| 0.7340277777777778 | 0 |
| 0.7347222222222222 | 0 |
| 0.7354166666666666 | 0 |
| 0.7361111111111112 | 0 |
| 0.7368055555555556 | 0 |
| 0.7374999999999999 | 0 |
| 0.7381944444444444 | 0 |
| 0.7388888888888889 | 0 |
| 0.7395833333333334 | 0 |
| 0.7402777777777777 | 0 |
| 0.7409722222222223 | 0 |
| 0.7416666666666667 | 0 |
| 0.7423611111111111 | 0 |
| 0.7430555555555555 | 0 |
| 0.74375 | 0 |
| 0.7444444444444445 | 0 |
| 0.7451388888888889 | 0 |
| 0.7458333333333332 | 0 |
| 0.7465277777777778 | 0 |
| 0.7472222222222222 | 0 |
| 0.7479166666666667 | 0 |
| 0.748611111111111 | 0 |
| 0.7493055555555556 | 0 |
| 0.75 | 0 |
| 0.7506944444444444 | 0 |
| 0.751388888888889 | 0 |
| 0.7520833333333333 | 0 |
| 0.7527777777777778 | 0 |
| 0.7534722222222222 | 0 |
| 0.7541666666666668 | 0 |
| 0.7548611111111111 | 0 |
| 0.7555555555555555 | 0 |
| 0.75625 | 0 |
| 0.7569444444444445 | 0 |
| 0.7576388888888889 | 0 |
| 0.7583333333333333 | 0 |
| 0.7590277777777777 | 0 |
| 0.7597222222222223 | 0 |
| 0.7604166666666666 | 0 |
| 0.7611111111111111 | 0 |
| 0.7618055555555556 | 0 |
| 0.7625000000000001 | 0 |
| 0.7631944444444444 | 0 |
| 0.7638888888888888 | 0 |
| 0.7645833333333334 | 0 |
| 0.7652777777777778 | 0 |
| 0.7659722222222222 | 0 |
| 0.7666666666666666 | 0 |
| 0.7673611111111112 | 0 |
| 0.7680555555555556 | 0 |
| 0.7687499999999999 | 0 |
| 0.7694444444444444 | 0 |
| 0.7701388888888889 | 0 |
| 0.7708333333333334 | 0 |
| 0.7715277777777777 | 0 |
| 0.7722222222222223 | 0 |
| 0.7729166666666667 | 0 |
| 0.7736111111111111 | 0 |
| 0.7743055555555555 | 0 |
| 0.775 | 0 |
| 0.7756944444444445 | 0 |
| 0.7763888888888889 | 0 |
| 0.7770833333333332 | 0 |
| 0.7777777777777778 | 0 |
| 0.7784722222222222 | 0 |
| 0.7791666666666667 | 0 |
| 0.779861111111111 | 0 |
| 0.7805555555555556 | 0 |
| 0.78125 | 0 |
| 0.7819444444444444 | 0 |
| 0.782638888888889 | 0 |
| 0.7833333333333333 | 0 |
| 0.7840277777777778 | 0 |
| 0.7847222222222222 | 0 |
| 0.7854166666666668 | 0 |
| 0.7861111111111111 | 0 |
| 0.7868055555555555 | 0 |
| 0.7875 | 0 |
| 0.7881944444444445 | 0 |
| 0.7888888888888889 | 0 |
| 0.7895833333333333 | 0 |
| 0.7902777777777777 | 0 |
| 0.7909722222222223 | 0 |
| 0.7916666666666666 | 0 |
| 0.7923611111111111 | 0 |
| 0.7930555555555556 | 0 |
| 0.7937500000000001 | 0 |
| 0.7944444444444444 | 0 |
| 0.7951388888888888 | 0 |
| 0.7958333333333334 | 0 |
| 0.7965277777777778 | 0 |
| 0.7972222222222222 | 0 |
| 0.7979166666666666 | 0 |
| 0.7986111111111112 | 0 |
| 0.7993055555555556 | 0 |
| 0.7999999999999999 | 0 |
| 0.8006944444444444 | 0 |
| 0.8013888888888889 | 0 |
| 0.8020833333333334 | 0 |
| 0.8027777777777777 | 0 |
| 0.8034722222222223 | 0 |
| 0.8041666666666667 | 0 |
| 0.8048611111111111 | 0 |
| 0.8055555555555555 | 0 |
| 0.80625 | 0 |
| 0.8069444444444445 | 0 |
| 0.8076388888888889 | 0 |
| 0.8083333333333332 | 0 |
| 0.8090277777777778 | 0 |
| 0.8097222222222222 | 0 |
| 0.8104166666666667 | 0 |
| 0.811111111111111 | 0 |
| 0.8118055555555556 | 0 |
| 0.8125 | 0 |
| 0.8131944444444444 | 0 |
| 0.813888888888889 | 0 |
| 0.8145833333333333 | 0 |
| 0.8152777777777778 | 0 |
| 0.8159722222222222 | 0 |
| 0.8166666666666668 | 0 |
| 0.8173611111111111 | 0 |
| 0.8180555555555555 | 0 |
| 0.81875 | 0 |
| 0.8194444444444445 | 0 |
| 0.8201388888888889 | 0 |
| 0.8208333333333333 | 0 |
| 0.8215277777777777 | 0 |
| 0.8222222222222223 | 0 |
| 0.8229166666666666 | 0 |
| 0.8236111111111111 | 0 |
| 0.8243055555555556 | 0 |
| 0.8250000000000001 | 0 |
| 0.8256944444444444 | 0 |
| 0.8263888888888888 | 0 |
| 0.8270833333333334 | 0 |
| 0.8277777777777778 | 0 |
| 0.8284722222222222 | 0 |
| 0.8291666666666666 | 0 |
| 0.8298611111111112 | 0 |
| 0.8305555555555556 | 0 |
| 0.8312499999999999 | 0 |
| 0.8319444444444444 | 0 |
| 0.8326388888888889 | 0 |
| 0.8333333333333334 | 0 |
| 0.8340277777777777 | 0 |
| 0.8347222222222223 | 0 |
| 0.8354166666666667 | 0 |
| 0.8361111111111111 | 0 |
| 0.8368055555555555 | 0 |
| 0.8375 | 0 |
| 0.8381944444444445 | 0 |
| 0.8388888888888889 | 0 |
| 0.8395833333333332 | 0 |
| 0.8402777777777778 | 0 |
| 0.8409722222222222 | 0 |
| 0.8416666666666667 | 0 |
| 0.842361111111111 | 0 |
| 0.8430555555555556 | 0 |
| 0.84375 | 0 |
| 0.8444444444444444 | 0 |
| 0.845138888888889 | 0 |
| 0.8458333333333333 | 0 |
| 0.8465277777777778 | 0 |
| 0.8472222222222222 | 0 |
| 0.8479166666666668 | 0 |
| 0.8486111111111111 | 0 |
| 0.8493055555555555 | 0 |
| 0.85 | 0 |
| 0.8506944444444445 | 0 |
| 0.8513888888888889 | 0 |
| 0.8520833333333333 | 0 |
| 0.8527777777777777 | 0 |
| 0.8534722222222223 | 0 |
| 0.8541666666666666 | 0 |
| 0.8548611111111111 | 0 |
| 0.8555555555555556 | 0 |
| 0.8562500000000001 | 0 |
| 0.8569444444444444 | 0 |
| 0.8576388888888888 | 0 |
| 0.8583333333333334 | 0 |
| 0.8590277777777778 | 0 |
| 0.8597222222222222 | 0 |
| 0.8604166666666666 | 0 |
| 0.8611111111111112 | 0 |
| 0.8618055555555556 | 0 |
| 0.8624999999999999 | 0 |
| 0.8631944444444444 | 0 |
| 0.8638888888888889 | 0 |
| 0.8645833333333334 | 0 |
| 0.8652777777777777 | 0 |
| 0.8659722222222223 | 0 |
| 0.8666666666666667 | 0 |
| 0.8673611111111111 | 0 |
| 0.8680555555555555 | 0 |
| 0.86875 | 0 |
| 0.8694444444444445 | 0 |
| 0.8701388888888889 | 0 |
| 0.8708333333333332 | 0 |
| 0.8715277777777778 | 0 |
| 0.8722222222222222 | 0 |
| 0.8729166666666667 | 0 |
| 0.873611111111111 | 0 |
| 0.8743055555555556 | 0 |
| 0.875 | 0 |
| 0.8756944444444444 | 0 |
| 0.876388888888889 | 0 |
| 0.8770833333333333 | 0 |
| 0.8777777777777778 | 0 |
| 0.8784722222222222 | 0 |
| 0.8791666666666668 | 0 |
| 0.8798611111111111 | 0 |
| 0.8805555555555555 | 0 |
| 0.88125 | 0 |
| 0.8819444444444445 | 0 |
| 0.8826388888888889 | 0 |
| 0.8833333333333333 | 0 |
| 0.8840277777777777 | 0 |
| 0.8847222222222223 | 0 |
| 0.8854166666666666 | 0 |
| 0.8861111111111111 | 0 |
| 0.8868055555555556 | 0 |
| 0.8875000000000001 | 0 |
| 0.8881944444444444 | 0 |
| 0.8888888888888888 | 0 |
| 0.8895833333333334 | 0 |
| 0.8902777777777778 | 0 |
| 0.8909722222222222 | 0 |
| 0.8916666666666666 | 0 |
| 0.8923611111111112 | 0 |
| 0.8930555555555556 | 0 |
| 0.8937499999999999 | 0 |
| 0.8944444444444444 | 0 |
| 0.8951388888888889 | 0 |
| 0.8958333333333334 | 0 |
| 0.8965277777777777 | 0 |
| 0.8972222222222223 | 0 |
| 0.8979166666666667 | 0 |
| 0.8986111111111111 | 0 |
| 0.8993055555555555 | 0 |
| 0.9 | 0 |
| 0.9006944444444445 | 0 |
| 0.9013888888888889 | 0 |
| 0.9020833333333332 | 0 |
| 0.9027777777777778 | 0 |
| 0.9034722222222222 | 0 |
| 0.9041666666666667 | 0 |
| 0.904861111111111 | 0 |
| 0.9055555555555556 | 0 |
| 0.90625 | 0 |
| 0.9069444444444444 | 0 |
| 0.907638888888889 | 0 |
| 0.9083333333333333 | 0 |
| 0.9090277777777778 | 0 |
| 0.9097222222222222 | 0 |
| 0.9104166666666668 | 0 |
| 0.9111111111111111 | 0 |
| 0.9118055555555555 | 0 |
| 0.9125 | 0 |
| 0.9131944444444445 | 0 |
| 0.9138888888888889 | 0 |
| 0.9145833333333333 | 0 |
| 0.9152777777777777 | 0 |
| 0.9159722222222223 | 0 |
| 0.9166666666666666 | 0 |
| 0.9173611111111111 | 0 |
| 0.9180555555555556 | 0 |
| 0.9187500000000001 | 0 |
| 0.9194444444444444 | 0 |
| 0.9201388888888888 | 0 |
| 0.9208333333333334 | 0 |
| 0.9215277777777778 | 0 |
| 0.9222222222222222 | 0 |
| 0.9229166666666666 | 0 |
| 0.9236111111111112 | 0 |
| 0.9243055555555556 | 0 |
| 0.9249999999999999 | 0 |
| 0.9256944444444444 | 0 |
| 0.9263888888888889 | 0 |
| 0.9270833333333334 | 0 |
| 0.9277777777777777 | 0 |
| 0.9284722222222223 | 0 |
| 0.9291666666666667 | 0 |
| 0.9298611111111111 | 0 |
| 0.9305555555555555 | 0 |
| 0.93125 | 0 |
| 0.9319444444444445 | 0 |
| 0.9326388888888889 | 0 |
| 0.9333333333333332 | 0 |
| 0.9340277777777778 | 0 |
| 0.9347222222222222 | 0 |
| 0.9354166666666667 | 0 |
| 0.936111111111111 | 0 |
| 0.9368055555555556 | 0 |
| 0.9375 | 0 |
| 0.9381944444444444 | 0 |
| 0.938888888888889 | 0 |
| 0.9395833333333333 | 0 |
| 0.9402777777777778 | 0 |
| 0.9409722222222222 | 0 |
| 0.9416666666666668 | 0 |
| 0.9423611111111111 | 0 |
| 0.9430555555555555 | 0 |
| 0.94375 | 0 |
| 0.9444444444444445 | 0 |
| 0.9451388888888889 | 0 |
| 0.9458333333333333 | 0 |
| 0.9465277777777777 | 0 |
| 0.9472222222222223 | 0 |
| 0.9479166666666666 | 0 |
| 0.9486111111111111 | 0 |
| 0.9493055555555556 | 0 |
| 0.9500000000000001 | 0 |
| 0.9506944444444444 | 0 |
| 0.9513888888888888 | 0 |
| 0.9520833333333334 | 0 |
| 0.9527777777777778 | 0 |
| 0.9534722222222222 | 0 |
| 0.9541666666666666 | 0 |
| 0.9548611111111112 | 0 |
| 0.9555555555555556 | 0 |
| 0.9562499999999999 | 0 |
| 0.9569444444444444 | 0 |
| 0.9576388888888889 | 0 |
| 0.9583333333333334 | 0 |
| 0.9590277777777777 | 0 |
| 0.9597222222222223 | 0 |
| 0.9604166666666667 | 0 |
| 0.9611111111111111 | 0 |
| 0.9618055555555555 | 0 |
| 0.9625 | 0 |
| 0.9631944444444445 | 0 |
| 0.9638888888888889 | 0 |
| 0.9645833333333332 | 0 |
| 0.9652777777777778 | 0 |
| 0.9659722222222222 | 0 |
| 0.9666666666666667 | 0 |
| 0.967361111111111 | 0 |
| 0.9680555555555556 | 0 |
| 0.96875 | 0 |
| 0.9694444444444444 | 0 |
| 0.970138888888889 | 0 |
| 0.9708333333333333 | 0 |
| 0.9715277777777778 | 0 |
| 0.9722222222222222 | 0 |
| 0.9729166666666668 | 0 |
| 0.9736111111111111 | 0 |
| 0.9743055555555555 | 0 |
| 0.975 | 0 |
| 0.9756944444444445 | 0 |
| 0.9763888888888889 | 0 |
| 0.9770833333333333 | 0 |
| 0.9777777777777777 | 0 |
| 0.9784722222222223 | 0 |
| 0.9791666666666666 | 0 |
| 0.9798611111111111 | 0 |
| 0.9805555555555556 | 0 |
| 0.9812500000000001 | 0 |
| 0.9819444444444444 | 0 |
| 0.9826388888888888 | 0 |
| 0.9833333333333334 | 0 |
| 0.9840277777777778 | 0 |
| 0.9847222222222222 | 0 |
| 0.9854166666666666 | 0 |
| 0.9861111111111112 | 0 |
| 0.9868055555555556 | 0 |
| 0.9874999999999999 | 0 |
| 0.9881944444444444 | 0 |
| 0.9888888888888889 | 0 |
| 0.9895833333333334 | 0 |
| 0.9902777777777777 | 0 |
| 0.9909722222222223 | 0 |
| 0.9916666666666667 | 0 |
| 0.9923611111111111 | 0 |
| 0.9930555555555555 | 0 |
| 0.99375 | 0 |
| 0.9944444444444445 | 0 |
| 0.9951388888888889 | 0 |
| 0.9958333333333332 | 0 |
| 0.9965277777777778 | 0 |
| 0.9972222222222222 | 0 |
| 0.9979166666666667 | 0 |
| 0.998611111111111 | 0 |
| 0.9993055555555556 | 0 |